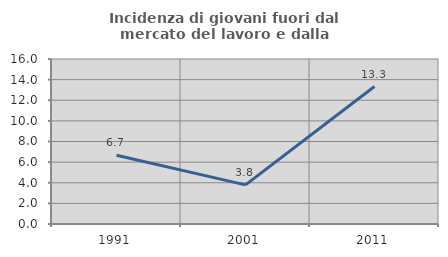
| Category | Incidenza di giovani fuori dal mercato del lavoro e dalla formazione  |
|---|---|
| 1991.0 | 6.667 |
| 2001.0 | 3.797 |
| 2011.0 | 13.333 |